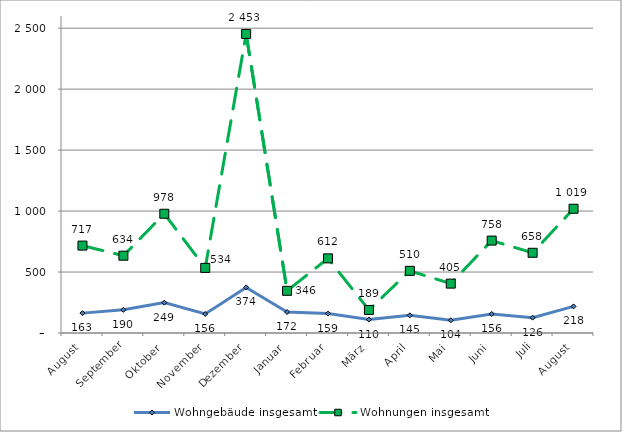
| Category | Wohngebäude insgesamt | Wohnungen insgesamt |
|---|---|---|
| August | 163 | 717 |
| September | 190 | 634 |
| Oktober | 249 | 978 |
| November | 156 | 534 |
| Dezember | 374 | 2453 |
| Januar | 172 | 346 |
| Februar | 159 | 612 |
| März | 110 | 189 |
| April | 145 | 510 |
| Mai | 104 | 405 |
| Juni | 156 | 758 |
| Juli | 126 | 658 |
| August | 218 | 1019 |